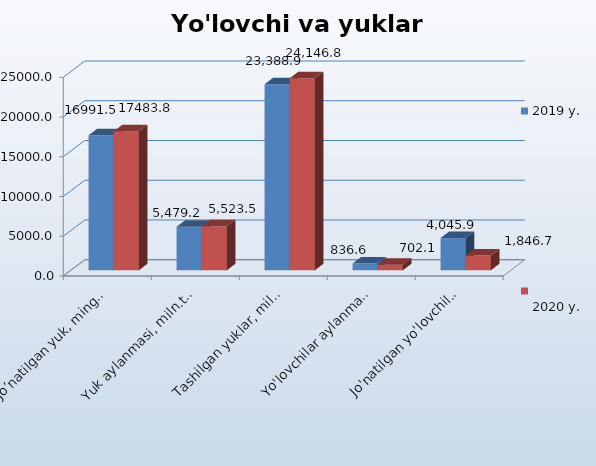
| Category | 2019 y. | 
2020 y. |
|---|---|---|
| Jo’natilgan yuk, ming.tonna | 16991.5 | 17483.8 |
| Yuk aylanmasi, miln.tonna-km | 5479.2 | 5523.5 |
| Tashilgan yuklar, miln.tonna | 23388.9 | 24146.8 |
| Yo'lovchilar aylanmasi, mln.yo'lovchi-km | 836.6 | 702.1 |
| Jo'natilgan yo'lovchilar, ming.odam | 4045.9 | 1846.7 |